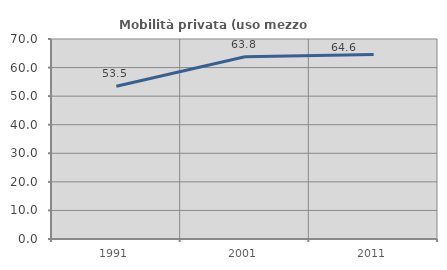
| Category | Mobilità privata (uso mezzo privato) |
|---|---|
| 1991.0 | 53.48 |
| 2001.0 | 63.776 |
| 2011.0 | 64.578 |